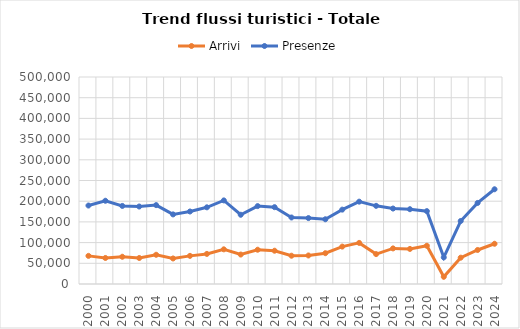
| Category | Arrivi | Presenze |
|---|---|---|
| 2000.0 | 67944 | 189510 |
| 2001.0 | 62863 | 201064 |
| 2002.0 | 65811 | 188579 |
| 2003.0 | 62828 | 187171 |
| 2004.0 | 70577 | 190537 |
| 2005.0 | 61667 | 168102 |
| 2006.0 | 67965 | 175131 |
| 2007.0 | 72672 | 185204 |
| 2008.0 | 83736 | 201910 |
| 2009.0 | 71155 | 167251 |
| 2010.0 | 82804 | 188162 |
| 2011.0 | 80403 | 185609 |
| 2012.0 | 68324 | 160671 |
| 2013.0 | 68901 | 159228 |
| 2014.0 | 74415 | 156326 |
| 2015.0 | 90354 | 179636 |
| 2016.0 | 99257 | 198879 |
| 2017.0 | 72229 | 188801 |
| 2018.0 | 85962 | 182260 |
| 2019.0 | 84719 | 180658 |
| 2020.0 | 92361 | 175980 |
| 2021.0 | 17394 | 64290 |
| 2022.0 | 63571 | 152159 |
| 2023.0 | 82166 | 195784 |
| 2024.0 | 97206 | 228834 |